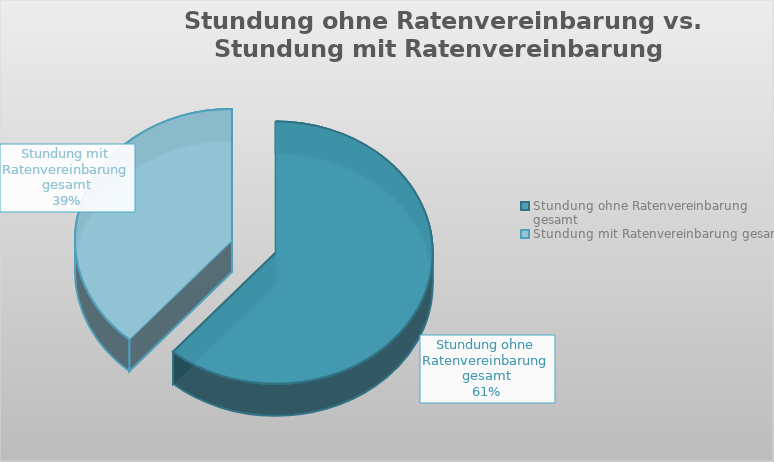
| Category | Series 0 |
|---|---|
| Stundung ohne Ratenvereinbarung gesamt | 10000 |
| Stundung mit Ratenvereinbarung gesamt | 6300 |